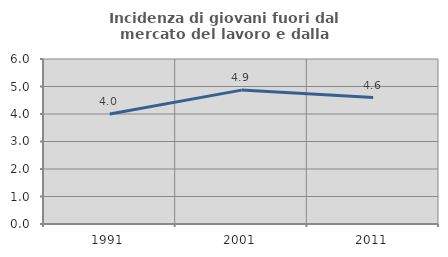
| Category | Incidenza di giovani fuori dal mercato del lavoro e dalla formazione  |
|---|---|
| 1991.0 | 4 |
| 2001.0 | 4.869 |
| 2011.0 | 4.598 |